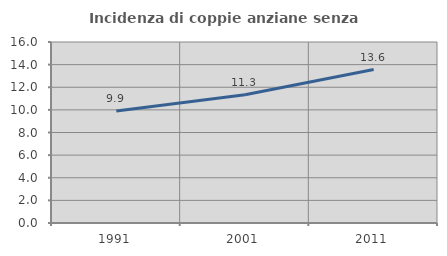
| Category | Incidenza di coppie anziane senza figli  |
|---|---|
| 1991.0 | 9.898 |
| 2001.0 | 11.333 |
| 2011.0 | 13.561 |